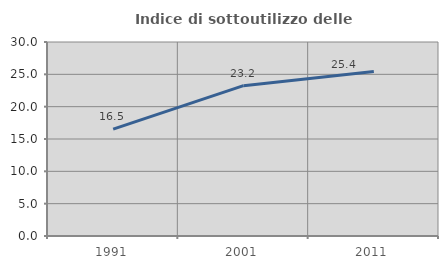
| Category | Indice di sottoutilizzo delle abitazioni  |
|---|---|
| 1991.0 | 16.535 |
| 2001.0 | 23.248 |
| 2011.0 | 25.42 |